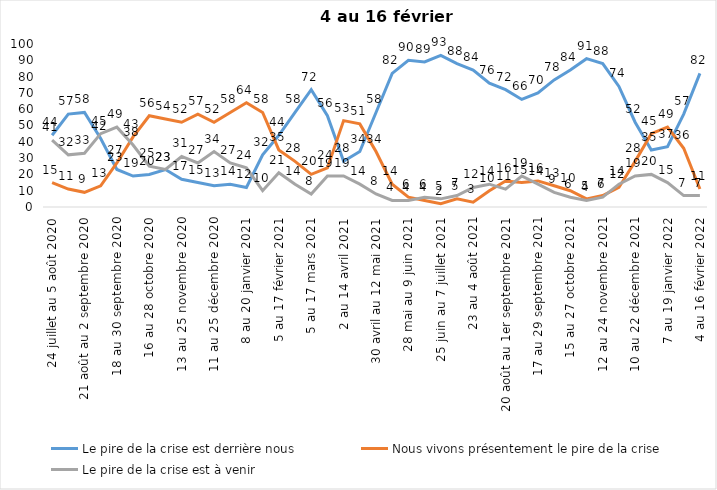
| Category | Le pire de la crise est derrière nous | Nous vivons présentement le pire de la crise | Le pire de la crise est à venir |
|---|---|---|---|
| 24 juillet au 5 août 2020 | 44 | 15 | 41 |
| 7 au 19 août 2020 | 57 | 11 | 32 |
| 21 août au 2 septembre 2020 | 58 | 9 | 33 |
| 4 au 16 septembre 2020 | 42 | 13 | 45 |
| 18 au 30 septembre 2020 | 23 | 27 | 49 |
| 2 au 14 octobre 2020 | 19 | 43 | 38 |
| 16 au 28 octobre 2020 | 20 | 56 | 25 |
| 30 octobre au 11 novembre 2020 | 23 | 54 | 23 |
| 13 au 25 novembre 2020 | 17 | 52 | 31 |
| 27 au 9 décembre 2020 | 15 | 57 | 27 |
| 11 au 25 décembre 2020 | 13 | 52 | 34 |
| 25 décembre 2020 au 6 janvier 2021 | 14 | 58 | 27 |
| 8 au 20 janvier 2021 | 12 | 64 | 24 |
| 22 janvier au 3 février 2021 | 32 | 58 | 10 |
| 5 au 17 février 2021 | 44 | 35 | 21 |
| 19 février au 3 mars 2021 | 58 | 28 | 14 |
| 5 au 17 mars 2021 | 72 | 20 | 8 |
| 19 au 31 mars 2021 | 56 | 24 | 19 |
| 2 au 14 avril 2021 | 28 | 53 | 19 |
| 16 au 28 avril 2021 | 34 | 51 | 14 |
| 30 avril au 12 mai 2021 | 58 | 34 | 8 |
| 14 au 26 mai 2021 | 82 | 14 | 4 |
| 28 mai au 9 juin 2021 | 90 | 6 | 4 |
| 11 au 23 juin 2021 | 89 | 4 | 6 |
| 25 juin au 7 juillet 2021 | 93 | 2 | 5 |
| 9 au 21 juillet 2021 | 88 | 5 | 7 |
| 23 au 4 août 2021 | 84 | 3 | 12 |
| 6 au 18 août 2021 | 76 | 10 | 14 |
| 20 août au 1er septembre 2021 | 72 | 16 | 11 |
| 3 au 15 septembre 2021 | 66 | 15 | 19 |
| 17 au 29 septembre 2021 | 70 | 16 | 14 |
| 1 au 13 octobre 2021 | 78 | 13 | 9 |
| 15 au 27 octobre 2021 | 84 | 10 | 6 |
| 29 octobre au 10 novembre 2021 | 91 | 5 | 4 |
| 12 au 24 novembre 2021 | 88 | 7 | 6 |
| 26 novembre au 8 décembre 2021 | 74 | 12 | 14 |
| 10 au 22 décembre 2021 | 52 | 28 | 19 |
| 24 décembre 2021 au 5 janvier 2022 2022 | 35 | 45 | 20 |
| 7 au 19 janvier 2022 | 37 | 49 | 15 |
| 21 janvier au 2 février 2022 | 57 | 36 | 7 |
| 4 au 16 février 2022 | 82 | 11 | 7 |